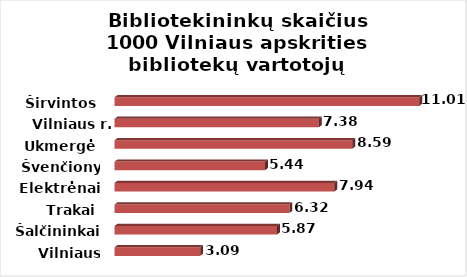
| Category | Series 0 |
|---|---|
| Vilniaus m. | 3.093 |
| Šalčininkai | 5.87 |
| Trakai | 6.315 |
| Elektrėnai | 7.936 |
| Švenčionys | 5.436 |
| Ukmergė | 8.587 |
| Vilniaus r. | 7.378 |
| Širvintos | 11.01 |